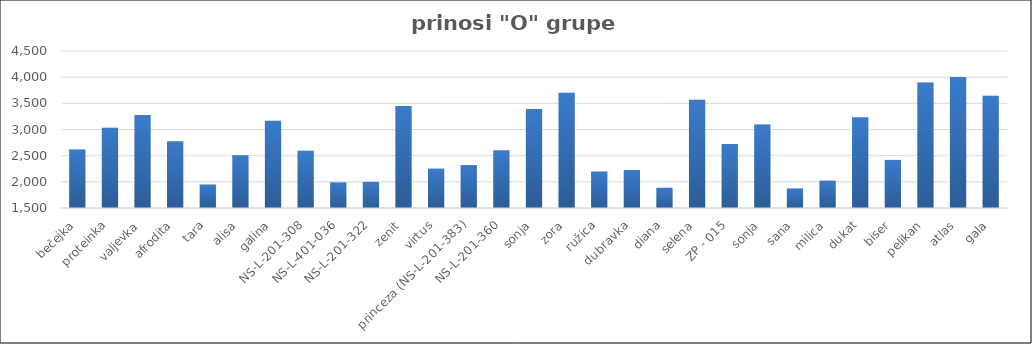
| Category | Series 0 |
|---|---|
| bečejka | 2615.836 |
| proteinka | 3033 |
| valjevka | 3274.847 |
| afrodita | 2776.475 |
| tara | 1948.067 |
| alisa | 2509.4 |
| galina | 3167.875 |
| NS-L-201-308 | 2595.6 |
| NS-L-401-036 | 1991 |
| NS-L-201-322 | 1999.275 |
| zenit | 3450.5 |
| virtus | 2252 |
| princeza (NS-L-201-383) | 2321 |
| NS-L-201-360 | 2602 |
| sonja | 3390.209 |
| zora | 3702.12 |
| ružica | 2197.71 |
| dubravka | 2225.87 |
| diana | 1886.2 |
| selena | 3568.375 |
| ZP - 015 | 2723.6 |
| sonja | 3094.439 |
| sana | 1874.34 |
| milica | 2022.993 |
| dukat | 3236.201 |
| biser | 2419 |
| pelikan | 3895.729 |
| atlas | 4004.554 |
| gala | 3643.561 |